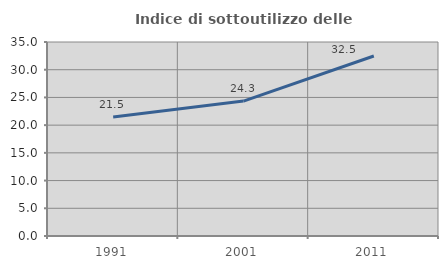
| Category | Indice di sottoutilizzo delle abitazioni  |
|---|---|
| 1991.0 | 21.457 |
| 2001.0 | 24.338 |
| 2011.0 | 32.469 |